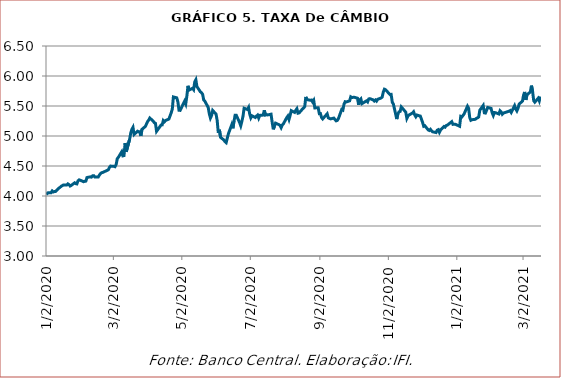
| Category | Taxa de câmbio |
|---|---|
| 1/2/20 | 4.021 |
| 1/3/20 | 4.052 |
| 1/6/20 | 4.055 |
| 1/7/20 | 4.084 |
| 1/8/20 | 4.067 |
| 1/9/20 | 4.074 |
| 1/10/20 | 4.074 |
| 1/13/20 | 4.131 |
| 1/14/20 | 4.144 |
| 1/15/20 | 4.162 |
| 1/16/20 | 4.173 |
| 1/17/20 | 4.184 |
| 1/20/20 | 4.183 |
| 1/21/20 | 4.201 |
| 1/22/20 | 4.189 |
| 1/23/20 | 4.166 |
| 1/24/20 | 4.177 |
| 1/27/20 | 4.22 |
| 1/28/20 | 4.206 |
| 1/29/20 | 4.201 |
| 1/30/20 | 4.252 |
| 1/31/20 | 4.27 |
| 2/3/20 | 4.248 |
| 2/4/20 | 4.238 |
| 2/5/20 | 4.245 |
| 2/6/20 | 4.248 |
| 2/7/20 | 4.308 |
| 2/10/20 | 4.32 |
| 2/11/20 | 4.315 |
| 2/12/20 | 4.337 |
| 2/13/20 | 4.339 |
| 2/14/20 | 4.316 |
| 2/17/20 | 4.316 |
| 2/18/20 | 4.347 |
| 2/19/20 | 4.373 |
| 2/20/20 | 4.387 |
| 2/21/20 | 4.392 |
| 2/26/20 | 4.436 |
| 2/27/20 | 4.476 |
| 2/28/20 | 4.499 |
| 3/2/20 | 4.495 |
| 3/3/20 | 4.488 |
| 3/4/20 | 4.526 |
| 3/5/20 | 4.621 |
| 3/6/20 | 4.646 |
| 3/9/20 | 4.738 |
| 3/10/20 | 4.669 |
| 3/11/20 | 4.674 |
| 3/12/20 | 4.883 |
| 3/13/20 | 4.736 |
| 3/16/20 | 4.947 |
| 3/17/20 | 5.05 |
| 3/18/20 | 5.111 |
| 3/19/20 | 5.144 |
| 3/20/20 | 5.025 |
| 3/23/20 | 5.08 |
| 3/24/20 | 5.071 |
| 3/25/20 | 5.071 |
| 3/26/20 | 5.001 |
| 3/27/20 | 5.111 |
| 3/30/20 | 5.159 |
| 3/31/20 | 5.199 |
| 4/1/20 | 5.24 |
| 4/2/20 | 5.265 |
| 4/3/20 | 5.3 |
| 4/6/20 | 5.247 |
| 4/7/20 | 5.222 |
| 4/8/20 | 5.212 |
| 4/9/20 | 5.078 |
| 4/13/20 | 5.182 |
| 4/14/20 | 5.186 |
| 4/15/20 | 5.258 |
| 4/16/20 | 5.238 |
| 4/17/20 | 5.257 |
| 4/20/20 | 5.284 |
| 4/22/20 | 5.385 |
| 4/23/20 | 5.447 |
| 4/24/20 | 5.651 |
| 4/27/20 | 5.636 |
| 4/28/20 | 5.568 |
| 4/29/20 | 5.429 |
| 4/30/20 | 5.427 |
| 5/4/20 | 5.582 |
| 5/5/20 | 5.535 |
| 5/6/20 | 5.668 |
| 5/7/20 | 5.836 |
| 5/8/20 | 5.765 |
| 5/11/20 | 5.795 |
| 5/12/20 | 5.772 |
| 5/13/20 | 5.902 |
| 5/14/20 | 5.937 |
| 5/15/20 | 5.823 |
| 5/18/20 | 5.738 |
| 5/19/20 | 5.722 |
| 5/20/20 | 5.697 |
| 5/21/20 | 5.602 |
| 5/22/20 | 5.581 |
| 5/25/20 | 5.477 |
| 5/26/20 | 5.371 |
| 5/27/20 | 5.299 |
| 5/28/20 | 5.34 |
| 5/29/20 | 5.426 |
| 6/1/20 | 5.364 |
| 6/2/20 | 5.26 |
| 6/3/20 | 5.052 |
| 6/4/20 | 5.104 |
| 6/5/20 | 4.978 |
| 6/8/20 | 4.933 |
| 6/9/20 | 4.906 |
| 6/10/20 | 4.889 |
| 6/12/20 | 5.037 |
| 6/15/20 | 5.188 |
| 6/16/20 | 5.128 |
| 6/17/20 | 5.25 |
| 6/18/20 | 5.347 |
| 6/19/20 | 5.347 |
| 6/22/20 | 5.223 |
| 6/23/20 | 5.17 |
| 6/24/20 | 5.244 |
| 6/25/20 | 5.329 |
| 6/26/20 | 5.463 |
| 6/29/20 | 5.442 |
| 6/30/20 | 5.476 |
| 7/1/20 | 5.365 |
| 7/2/20 | 5.303 |
| 7/3/20 | 5.337 |
| 7/6/20 | 5.308 |
| 7/7/20 | 5.332 |
| 7/8/20 | 5.348 |
| 7/9/20 | 5.298 |
| 7/10/20 | 5.344 |
| 7/13/20 | 5.349 |
| 7/14/20 | 5.429 |
| 7/15/20 | 5.349 |
| 7/16/20 | 5.356 |
| 7/17/20 | 5.351 |
| 7/20/20 | 5.364 |
| 7/21/20 | 5.228 |
| 7/22/20 | 5.111 |
| 7/23/20 | 5.165 |
| 7/24/20 | 5.215 |
| 7/27/20 | 5.189 |
| 7/28/20 | 5.178 |
| 7/29/20 | 5.14 |
| 7/30/20 | 5.184 |
| 7/31/20 | 5.203 |
| 8/3/20 | 5.308 |
| 8/4/20 | 5.333 |
| 8/5/20 | 5.276 |
| 8/6/20 | 5.343 |
| 8/7/20 | 5.423 |
| 8/10/20 | 5.393 |
| 8/11/20 | 5.428 |
| 8/12/20 | 5.455 |
| 8/13/20 | 5.38 |
| 8/14/20 | 5.385 |
| 8/17/20 | 5.45 |
| 8/18/20 | 5.466 |
| 8/19/20 | 5.491 |
| 8/20/20 | 5.651 |
| 8/21/20 | 5.606 |
| 8/24/20 | 5.595 |
| 8/25/20 | 5.6 |
| 8/26/20 | 5.568 |
| 8/27/20 | 5.596 |
| 8/28/20 | 5.468 |
| 8/31/20 | 5.471 |
| 9/1/20 | 5.373 |
| 9/2/20 | 5.374 |
| 9/3/20 | 5.308 |
| 9/4/20 | 5.285 |
| 9/8/20 | 5.37 |
| 9/9/20 | 5.302 |
| 9/10/20 | 5.294 |
| 9/11/20 | 5.285 |
| 9/14/20 | 5.298 |
| 9/15/20 | 5.273 |
| 9/16/20 | 5.253 |
| 9/17/20 | 5.259 |
| 9/18/20 | 5.289 |
| 9/21/20 | 5.444 |
| 9/22/20 | 5.433 |
| 9/23/20 | 5.531 |
| 9/24/20 | 5.571 |
| 9/25/20 | 5.567 |
| 9/28/20 | 5.586 |
| 9/29/20 | 5.653 |
| 9/30/20 | 5.641 |
| 10/1/20 | 5.644 |
| 10/2/20 | 5.646 |
| 10/5/20 | 5.63 |
| 10/6/20 | 5.52 |
| 10/7/20 | 5.602 |
| 10/8/20 | 5.62 |
| 10/9/20 | 5.539 |
| 10/13/20 | 5.586 |
| 10/14/20 | 5.568 |
| 10/15/20 | 5.617 |
| 10/16/20 | 5.623 |
| 10/19/20 | 5.602 |
| 10/20/20 | 5.583 |
| 10/21/20 | 5.601 |
| 10/22/20 | 5.582 |
| 10/23/20 | 5.612 |
| 10/26/20 | 5.633 |
| 10/27/20 | 5.649 |
| 10/28/20 | 5.732 |
| 10/29/20 | 5.78 |
| 10/30/20 | 5.772 |
| 11/3/20 | 5.69 |
| 11/4/20 | 5.693 |
| 11/5/20 | 5.562 |
| 11/6/20 | 5.531 |
| 11/9/20 | 5.282 |
| 11/10/20 | 5.37 |
| 11/11/20 | 5.402 |
| 11/12/20 | 5.409 |
| 11/13/20 | 5.485 |
| 11/16/20 | 5.42 |
| 11/17/20 | 5.397 |
| 11/18/20 | 5.293 |
| 11/19/20 | 5.333 |
| 11/20/20 | 5.35 |
| 11/23/20 | 5.383 |
| 11/24/20 | 5.404 |
| 11/25/20 | 5.351 |
| 11/26/20 | 5.32 |
| 11/27/20 | 5.349 |
| 11/30/20 | 5.332 |
| 12/1/20 | 5.279 |
| 12/2/20 | 5.227 |
| 12/3/20 | 5.162 |
| 12/4/20 | 5.171 |
| 12/7/20 | 5.102 |
| 12/8/20 | 5.092 |
| 12/9/20 | 5.111 |
| 12/10/20 | 5.085 |
| 12/11/20 | 5.069 |
| 12/14/20 | 5.058 |
| 12/15/20 | 5.097 |
| 12/16/20 | 5.106 |
| 12/17/20 | 5.061 |
| 12/18/20 | 5.099 |
| 12/21/20 | 5.157 |
| 12/22/20 | 5.147 |
| 12/23/20 | 5.174 |
| 12/24/20 | 5.18 |
| 12/28/20 | 5.239 |
| 12/29/20 | 5.194 |
| 12/30/20 | 5.197 |
| 12/31/20 | 5.197 |
| 1/4/21 | 5.163 |
| 1/5/21 | 5.327 |
| 1/6/21 | 5.318 |
| 1/7/21 | 5.343 |
| 1/8/21 | 5.368 |
| 1/11/21 | 5.497 |
| 1/12/21 | 5.464 |
| 1/13/21 | 5.307 |
| 1/14/21 | 5.262 |
| 1/15/21 | 5.271 |
| 1/18/21 | 5.279 |
| 1/19/21 | 5.294 |
| 1/20/21 | 5.303 |
| 1/21/21 | 5.317 |
| 1/22/21 | 5.43 |
| 1/25/21 | 5.509 |
| 1/26/21 | 5.386 |
| 1/27/21 | 5.382 |
| 1/28/21 | 5.428 |
| 1/29/21 | 5.476 |
| 2/1/21 | 5.461 |
| 2/2/21 | 5.388 |
| 2/3/21 | 5.342 |
| 2/4/21 | 5.391 |
| 2/5/21 | 5.388 |
| 2/8/21 | 5.367 |
| 2/9/21 | 5.422 |
| 2/10/21 | 5.402 |
| 2/11/21 | 5.363 |
| 2/12/21 | 5.382 |
| 2/17/21 | 5.414 |
| 2/18/21 | 5.424 |
| 2/19/21 | 5.392 |
| 2/22/21 | 5.504 |
| 2/23/21 | 5.449 |
| 2/24/21 | 5.418 |
| 2/25/21 | 5.46 |
| 2/26/21 | 5.53 |
| 3/1/21 | 5.583 |
| 3/2/21 | 5.684 |
| 3/3/21 | 5.734 |
| 3/4/21 | 5.601 |
| 3/5/21 | 5.687 |
| 3/8/21 | 5.734 |
| 3/9/21 | 5.84 |
| 3/10/21 | 5.745 |
| 3/11/21 | 5.589 |
| 3/12/21 | 5.564 |
| 3/15/21 | 5.63 |
| 3/16/21 | 5.585 |
| 3/17/21 | 5.658 |